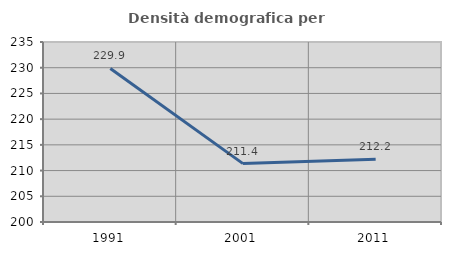
| Category | Densità demografica |
|---|---|
| 1991.0 | 229.852 |
| 2001.0 | 211.352 |
| 2011.0 | 212.182 |